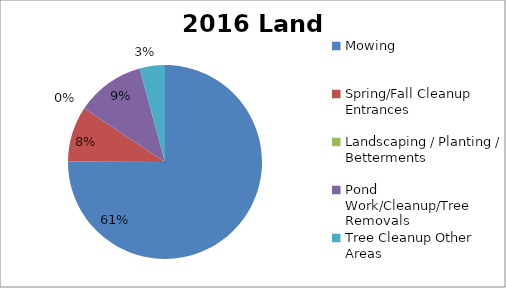
| Category | 2016 |
|---|---|
| Mowing | 0.615 |
| Spring/Fall Cleanup Entrances | 0.075 |
| Landscaping / Planting / Betterments | 0 |
| Pond Work/Cleanup/Tree Removals | 0.094 |
| Tree Cleanup Other Areas | 0.035 |